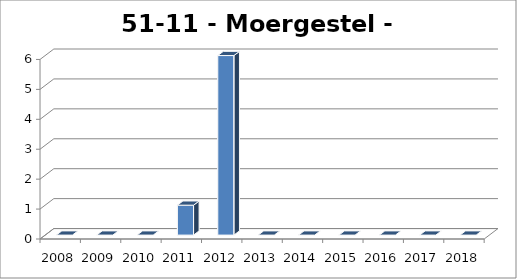
| Category | Moergestel - Oisterwijk |
|---|---|
| 2008.0 | 0 |
| 2009.0 | 0 |
| 2010.0 | 0 |
| 2011.0 | 1 |
| 2012.0 | 6 |
| 2013.0 | 0 |
| 2014.0 | 0 |
| 2015.0 | 0 |
| 2016.0 | 0 |
| 2017.0 | 0 |
| 2018.0 | 0 |